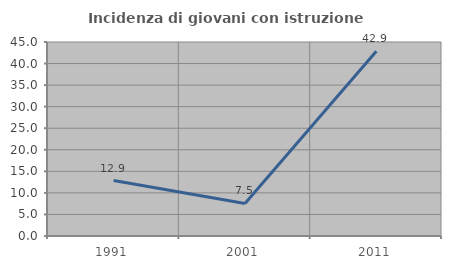
| Category | Incidenza di giovani con istruzione universitaria |
|---|---|
| 1991.0 | 12.857 |
| 2001.0 | 7.547 |
| 2011.0 | 42.857 |